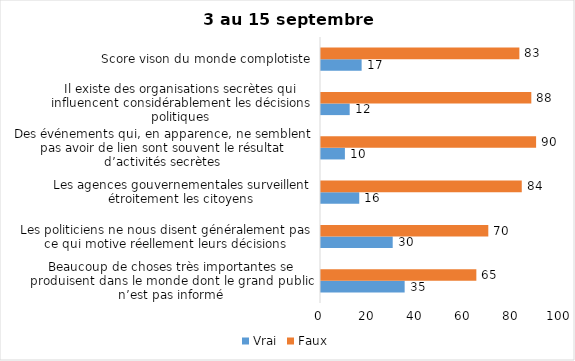
| Category | Vrai | Faux |
|---|---|---|
| Beaucoup de choses très importantes se produisent dans le monde dont le grand public n’est pas informé | 35 | 65 |
| Les politiciens ne nous disent généralement pas ce qui motive réellement leurs décisions | 30 | 70 |
| Les agences gouvernementales surveillent étroitement les citoyens | 16 | 84 |
| Des événements qui, en apparence, ne semblent pas avoir de lien sont souvent le résultat d’activités secrètes | 10 | 90 |
| Il existe des organisations secrètes qui influencent considérablement les décisions politiques | 12 | 88 |
| Score vison du monde complotiste | 17 | 83 |